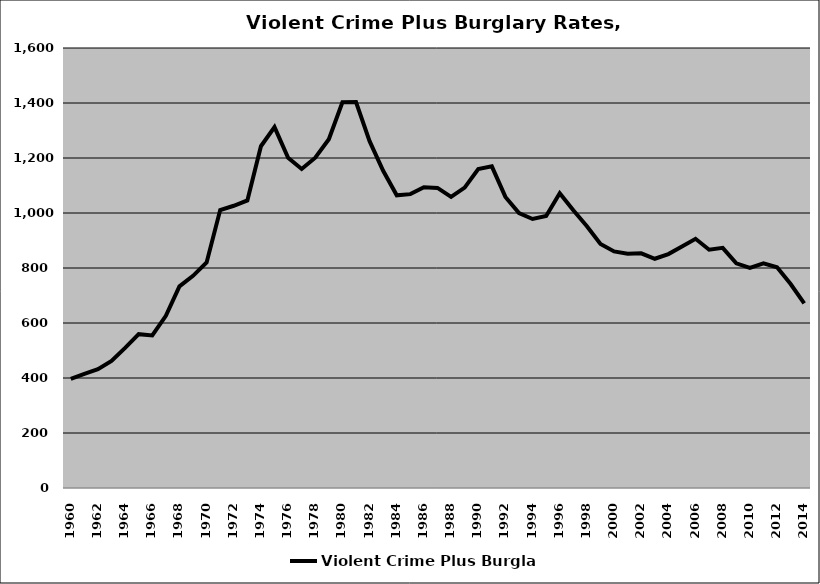
| Category | Violent Crime Plus Burglary |
|---|---|
| 1960.0 | 396.771 |
| 1961.0 | 415.19 |
| 1962.0 | 432.085 |
| 1963.0 | 461.896 |
| 1964.0 | 509.617 |
| 1965.0 | 559.497 |
| 1966.0 | 554.671 |
| 1967.0 | 626.262 |
| 1968.0 | 733.103 |
| 1969.0 | 771.617 |
| 1970.0 | 819.915 |
| 1971.0 | 1010.969 |
| 1972.0 | 1026.287 |
| 1973.0 | 1045.833 |
| 1974.0 | 1242.831 |
| 1975.0 | 1312.488 |
| 1976.0 | 1200.953 |
| 1977.0 | 1160.255 |
| 1978.0 | 1201.004 |
| 1979.0 | 1268.443 |
| 1980.0 | 1402.477 |
| 1981.0 | 1403.203 |
| 1982.0 | 1261.138 |
| 1983.0 | 1153.485 |
| 1984.0 | 1064.373 |
| 1985.0 | 1068.565 |
| 1986.0 | 1093.372 |
| 1987.0 | 1091.354 |
| 1988.0 | 1058.66 |
| 1989.0 | 1092.284 |
| 1990.0 | 1160.084 |
| 1991.0 | 1169.618 |
| 1992.0 | 1058.456 |
| 1993.0 | 999.502 |
| 1994.0 | 978.203 |
| 1995.0 | 989.074 |
| 1996.0 | 1072.18 |
| 1997.0 | 1009.634 |
| 1998.0 | 951.979 |
| 1999.0 | 887.676 |
| 2000.0 | 860.382 |
| 2001.0 | 851.631 |
| 2002.0 | 853.187 |
| 2003.0 | 833.643 |
| 2004.0 | 850.71 |
| 2005.0 | 877.807 |
| 2006.0 | 906.136 |
| 2007.0 | 866.426 |
| 2008.0 | 873.259 |
| 2009.0 | 816.834 |
| 2010.0 | 800.519 |
| 2011.0 | 817.29 |
| 2012.0 | 802.415 |
| 2013.0 | 741.904 |
| 2014.0 | 671.64 |